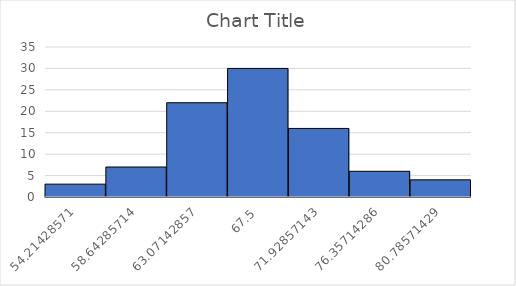
| Category | Series 0 |
|---|---|
| 54.214285714285715 | 3 |
| 58.642857142857146 | 7 |
| 63.07142857142858 | 22 |
| 67.5 | 30 |
| 71.92857142857144 | 16 |
| 76.35714285714286 | 6 |
| 80.7857142857143 | 4 |